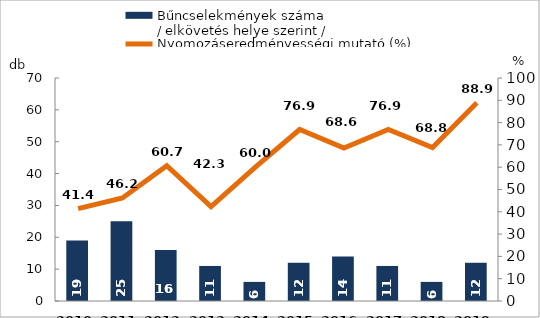
| Category | Bűncselekmények száma
/ elkövetés helye szerint / |
|---|---|
| 2010. év | 19 |
| 2011. év | 25 |
| 2012. év | 16 |
| 2013. év | 11 |
| 2014. év | 6 |
| 2015. év | 12 |
| 2016. év | 14 |
| 2017. év | 11 |
| 2018. év | 6 |
| 2019. év | 12 |